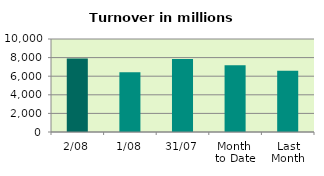
| Category | Series 0 |
|---|---|
| 2/08 | 7904.766 |
| 1/08 | 6436.492 |
| 31/07 | 7861.93 |
| Month 
to Date | 7170.629 |
| Last
Month | 6596.564 |